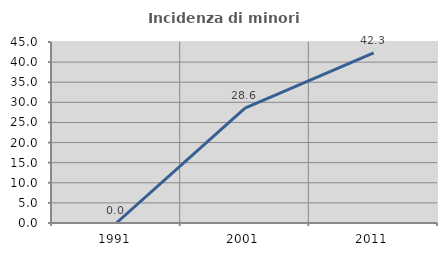
| Category | Incidenza di minori stranieri |
|---|---|
| 1991.0 | 0 |
| 2001.0 | 28.571 |
| 2011.0 | 42.308 |